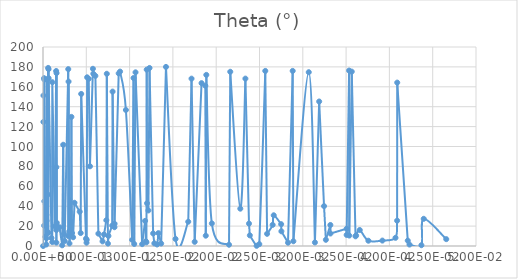
| Category | Theta (°) |
|---|---|
| 1.6e-05 | 0 |
| 4.8e-05 | 124.722 |
| 5.2e-05 | 151.236 |
| 0.000124 | 168.679 |
| 0.000132 | 20.457 |
| 0.000152 | 45 |
| 0.000156 | 167.276 |
| 0.000276 | 9.159 |
| 0.00032 | 41.752 |
| 0.000336 | 36.238 |
| 0.000384 | 1.496 |
| 0.000384 | 31.414 |
| 0.000396 | 7.726 |
| 0.000408 | 25.349 |
| 0.00046 | 167.464 |
| 0.000556 | 12.809 |
| 0.00056 | 51.721 |
| 0.000596 | 178.984 |
| 0.000604 | 13.55 |
| 0.00064 | 177.719 |
| 0.000652 | 168.616 |
| 0.00098 | 7.993 |
| 0.001072 | 3.919 |
| 0.001072 | 164.626 |
| 0.001364 | 19.788 |
| 0.00152 | 175.884 |
| 0.001532 | 15.98 |
| 0.00154 | 79.184 |
| 0.001548 | 3.39 |
| 0.001564 | 173.793 |
| 0.001588 | 23.292 |
| 0.001908 | 18.846 |
| 0.002216 | 0.692 |
| 0.002336 | 101.756 |
| 0.002428 | 12.189 |
| 0.002504 | 5.021 |
| 0.002916 | 177.758 |
| 0.002928 | 9.904 |
| 0.002952 | 165.245 |
| 0.003036 | 14.777 |
| 0.003056 | 2.569 |
| 0.003224 | 24.909 |
| 0.00328 | 129.759 |
| 0.003352 | 13.002 |
| 0.003476 | 8.796 |
| 0.00364 | 43.44 |
| 0.00424 | 34.451 |
| 0.004352 | 13.001 |
| 0.004412 | 152.842 |
| 0.004964 | 7.39 |
| 0.005028 | 3.32 |
| 0.005048 | 6.252 |
| 0.005096 | 169.53 |
| 0.00528 | 168.043 |
| 0.005424 | 80.093 |
| 0.005764 | 178.101 |
| 0.005812 | 173.102 |
| 0.006048 | 170.985 |
| 0.006396 | 12.42 |
| 0.006876 | 4.618 |
| 0.007048 | 11.58 |
| 0.007312 | 25.866 |
| 0.007368 | 173.079 |
| 0.0075 | 2.426 |
| 0.007556 | 10.116 |
| 0.007988 | 20.556 |
| 0.008036 | 155.195 |
| 0.008252 | 18.865 |
| 0.008268 | 22.341 |
| 0.00874 | 173.514 |
| 0.0089 | 175.296 |
| 0.009572 | 136.696 |
| 0.010292 | 6.143 |
| 0.010456 | 168.849 |
| 0.010532 | 2.024 |
| 0.010684 | 174.543 |
| 0.011448 | 1.847 |
| 0.011792 | 25.225 |
| 0.011888 | 4.66 |
| 0.011944 | 3.667 |
| 0.011976 | 177.276 |
| 0.012016 | 42.995 |
| 0.012172 | 35.72 |
| 0.0123 | 178.931 |
| 0.01272 | 12.614 |
| 0.012856 | 2.651 |
| 0.013172 | 1.528 |
| 0.013324 | 12.939 |
| 0.013644 | 2.493 |
| 0.0142 | 179.979 |
| 0.015304 | 7.066 |
| 0.016772 | 24.383 |
| 0.017152 | 168.2 |
| 0.017516 | 4.177 |
| 0.018308 | 163.679 |
| 0.018744 | 161.094 |
| 0.018796 | 10.362 |
| 0.01886 | 171.981 |
| 0.019496 | 22.727 |
| 0.02148 | 1.263 |
| 0.021624 | 175.114 |
| 0.022784 | 37.511 |
| 0.023372 | 168.23 |
| 0.023788 | 22.517 |
| 0.023884 | 10.704 |
| 0.024668 | 0.195 |
| 0.024976 | 1.854 |
| 0.025668 | 175.967 |
| 0.025876 | 12.226 |
| 0.02652 | 21.259 |
| 0.026644 | 30.864 |
| 0.0275 | 21.934 |
| 0.027528 | 14.777 |
| 0.028292 | 3.315 |
| 0.028832 | 175.981 |
| 0.028912 | 4.773 |
| 0.030688 | 174.671 |
| 0.0314 | 3.595 |
| 0.031892 | 145.227 |
| 0.032452 | 40.097 |
| 0.032664 | 6.224 |
| 0.033184 | 21.136 |
| 0.033196 | 12.547 |
| 0.03506 | 17.373 |
| 0.035064 | 11.131 |
| 0.035348 | 176.326 |
| 0.035368 | 10.493 |
| 0.035652 | 175.258 |
| 0.036088 | 9.726 |
| 0.036156 | 10.623 |
| 0.036576 | 16.087 |
| 0.037572 | 5.31 |
| 0.039192 | 5.45 |
| 0.040704 | 8.222 |
| 0.040892 | 25.441 |
| 0.040904 | 164.227 |
| 0.04212 | 5.397 |
| 0.04232 | 1.455 |
| 0.043696 | 0.807 |
| 0.043964 | 27.328 |
| 0.046564 | 6.886 |